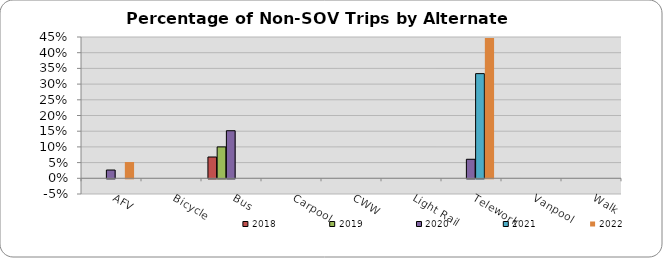
| Category | 2018 | 2019 | 2020 | 2021 | 2022 |
|---|---|---|---|---|---|
| AFV | 0 | 0 | 0.026 | 0 | 0.052 |
| Bicycle | 0 | 0 | 0 | 0 | 0 |
| Bus | 0.068 | 0.1 | 0.152 | 0 | 0 |
| Carpool | 0 | 0 | 0 | 0 | 0 |
| CWW | 0 | 0 | 0 | 0 | 0 |
| Light Rail | 0 | 0 | 0 | 0 | 0 |
| Telework | 0 | 0 | 0.061 | 0.333 | 0.446 |
| Vanpool | 0 | 0 | 0 | 0 | 0 |
| Walk | 0 | 0 | 0 | 0 | 0 |